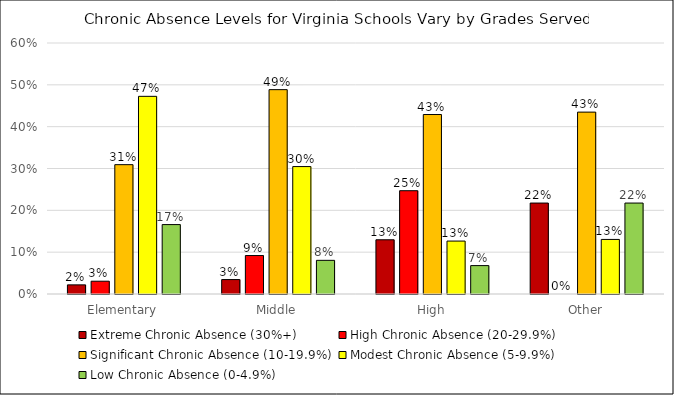
| Category | Extreme Chronic Absence (30%+) | High Chronic Absence (20-29.9%) | Significant Chronic Absence (10-19.9%) | Modest Chronic Absence (5-9.9%) | Low Chronic Absence (0-4.9%) |
|---|---|---|---|---|---|
| Elementary | 0.022 | 0.031 | 0.309 | 0.472 | 0.166 |
| Middle | 0.034 | 0.092 | 0.489 | 0.305 | 0.08 |
| High | 0.13 | 0.247 | 0.429 | 0.127 | 0.068 |
| Other | 0.217 | 0 | 0.435 | 0.13 | 0.217 |